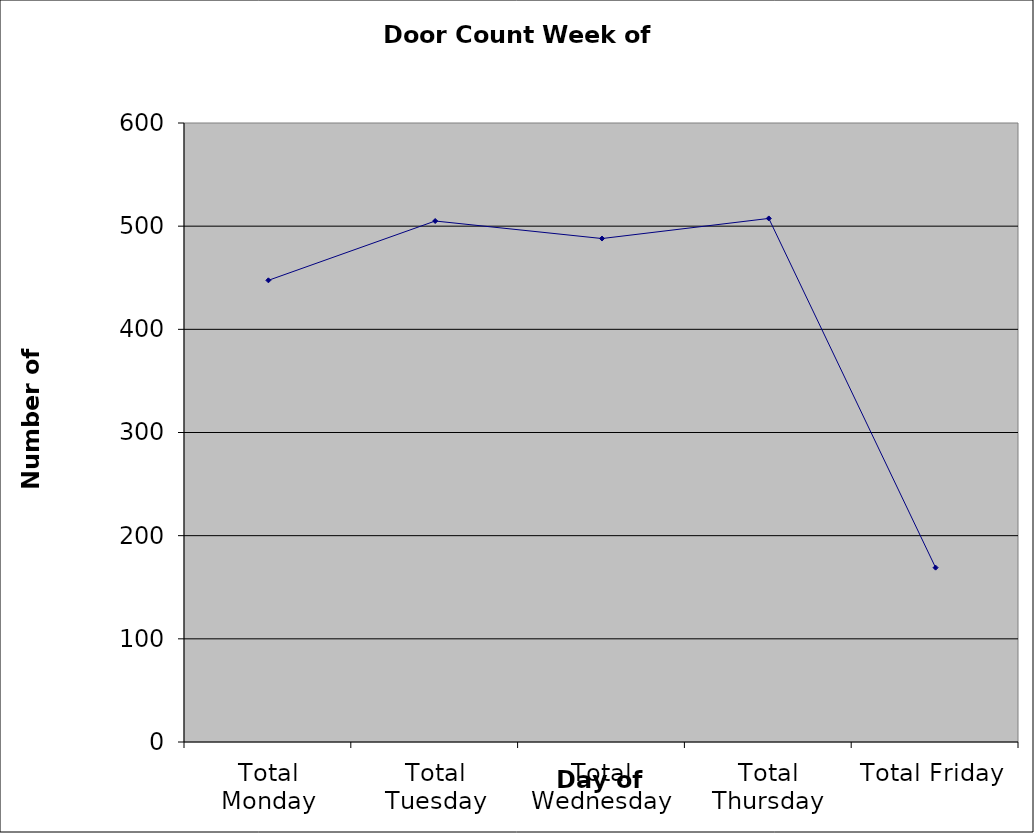
| Category | Series 0 |
|---|---|
| Total Monday | 447.5 |
| Total Tuesday | 505 |
| Total Wednesday | 488 |
| Total Thursday | 507.5 |
| Total Friday | 169 |